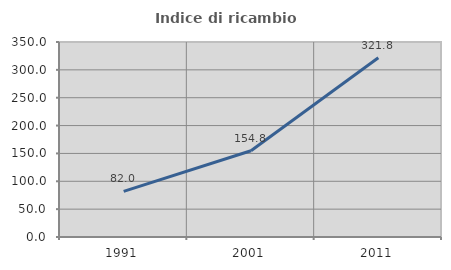
| Category | Indice di ricambio occupazionale  |
|---|---|
| 1991.0 | 82.007 |
| 2001.0 | 154.772 |
| 2011.0 | 321.757 |